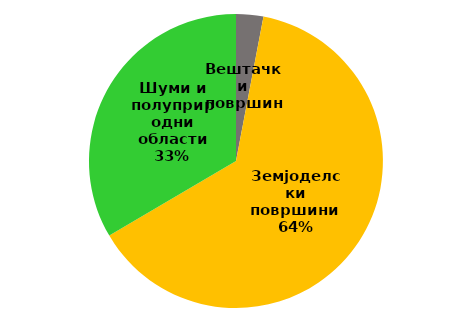
| Category | Series 0 |
|---|---|
| Вештачки површини | 76.62 |
| Земјоделски површини  | 1624.59 |
| Шуми и полуприродни области | 855.68 |